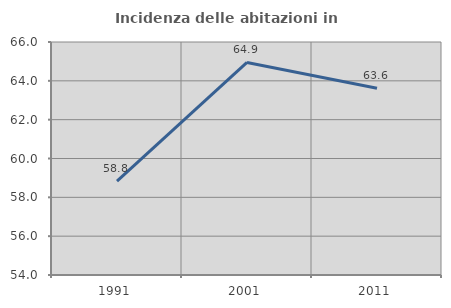
| Category | Incidenza delle abitazioni in proprietà  |
|---|---|
| 1991.0 | 58.838 |
| 2001.0 | 64.948 |
| 2011.0 | 63.618 |